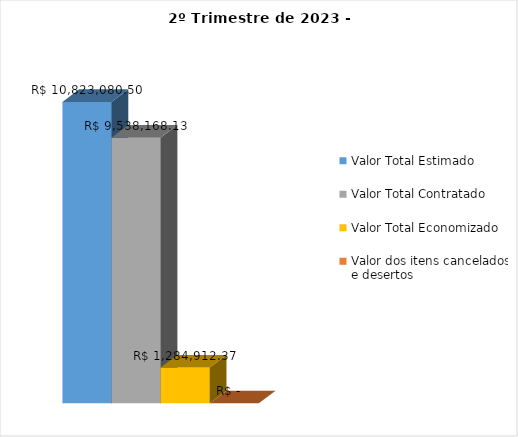
| Category | Valor Total Estimado | Valor Total Contratado | Valor Total Economizado | Valor dos itens cancelados e desertos |
|---|---|---|---|---|
| 0 | 10823080.5 | 9538168.126 | 1284912.374 | 0 |